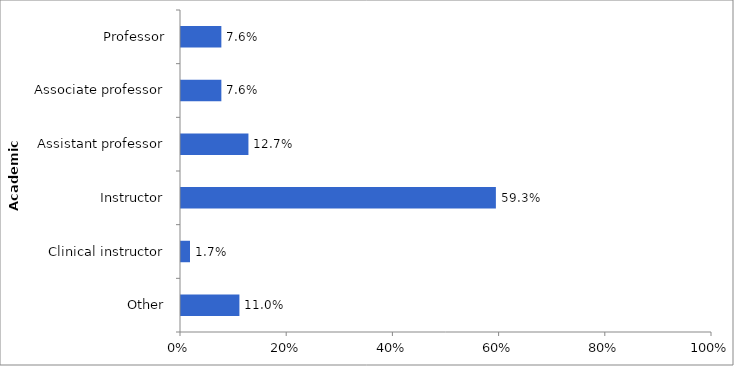
| Category | 2014-15 |
|---|---|
| Other | 0.11 |
| Clinical instructor | 0.017 |
| Instructor | 0.593 |
| Assistant professor | 0.127 |
| Associate professor | 0.076 |
| Professor | 0.076 |